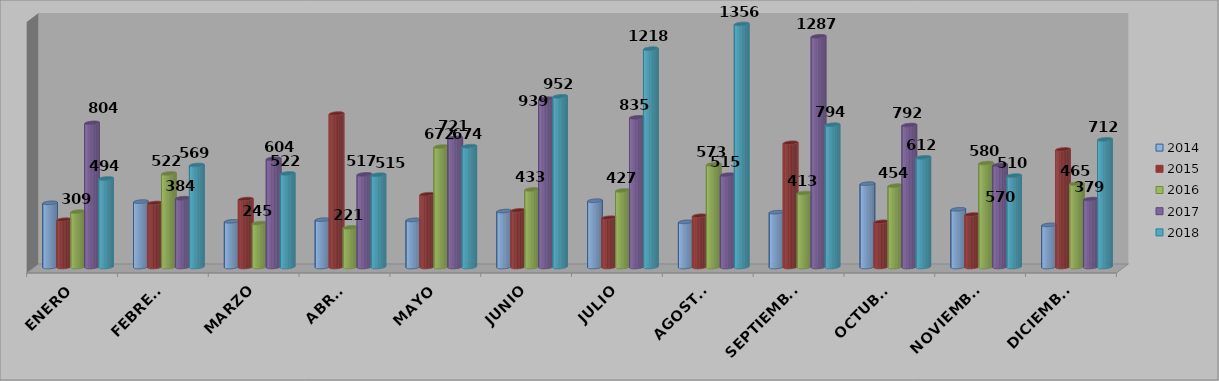
| Category | 2014 | 2015 | 2016 | 2017 | 2018 |
|---|---|---|---|---|---|
| ENERO | 358 | 264 | 309 | 804 | 494 |
| FEBRERO | 365 | 357 | 522 | 384 | 569 |
| MARZO | 255 | 379 | 245 | 604 | 522 |
| ABRIL | 264 | 856 | 221 | 517 | 515 |
| MAYO | 263 | 406 | 672 | 721 | 674 |
| JUNIO | 312 | 316 | 433 | 939 | 952 |
| JULIO | 370 | 275 | 427 | 835 | 1218 |
| AGOSTO | 252 | 286 | 573 | 515 | 1356 |
| SEPTIEMBRE | 306 | 693 | 413 | 1287 | 794 |
| OCTUBRE | 465 | 252 | 454 | 792 | 612 |
| NOVIEMBRE | 322 | 293 | 580 | 570 | 510 |
| DICIEMBRE | 235 | 656 | 465 | 379 | 712 |